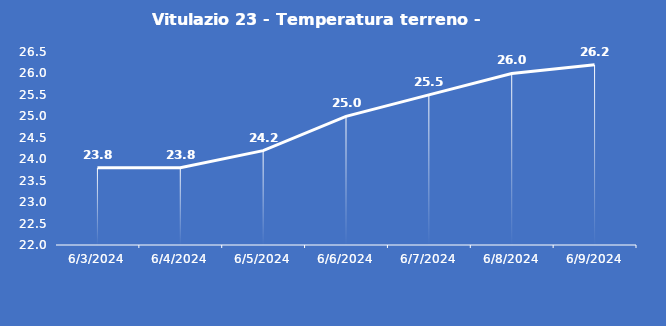
| Category | Vitulazio 23 - Temperatura terreno - Grezzo (°C) |
|---|---|
| 6/3/24 | 23.8 |
| 6/4/24 | 23.8 |
| 6/5/24 | 24.2 |
| 6/6/24 | 25 |
| 6/7/24 | 25.5 |
| 6/8/24 | 26 |
| 6/9/24 | 26.2 |